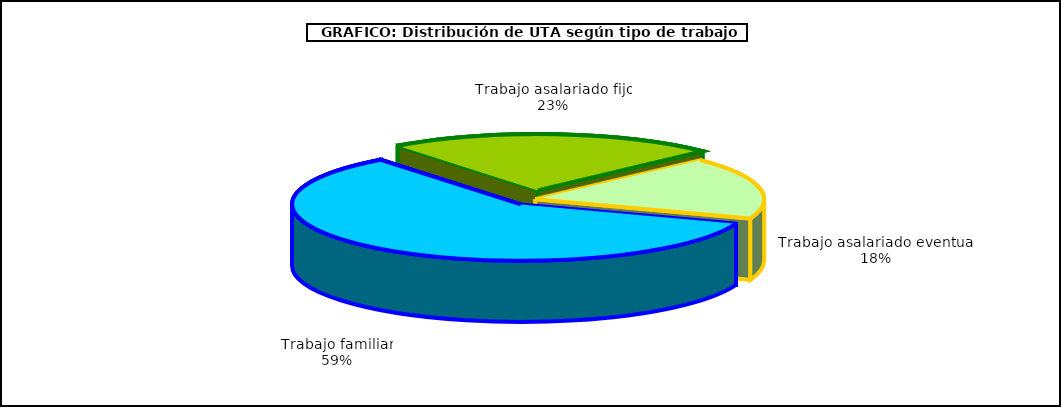
| Category | Series 0 |
|---|---|
| 0 | 472387 |
| 1 | 186497 |
| 2 | 142279 |